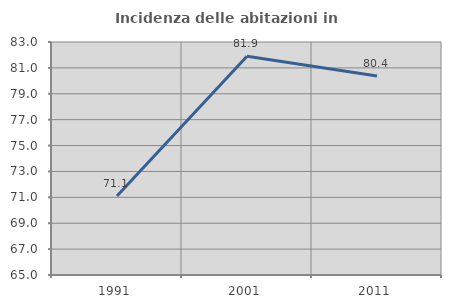
| Category | Incidenza delle abitazioni in proprietà  |
|---|---|
| 1991.0 | 71.108 |
| 2001.0 | 81.906 |
| 2011.0 | 80.372 |